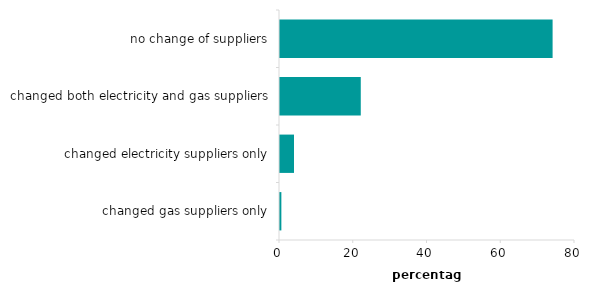
| Category | Series1 |
|---|---|
| 0 | 0.369 |
| 1 | 3.8 |
| 2 | 21.905 |
| 3 | 73.925 |